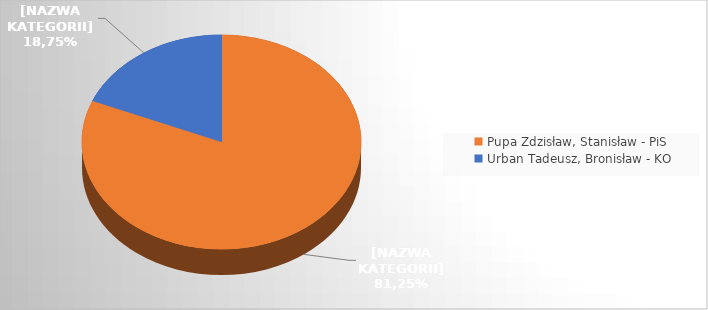
| Category | Series 0 |
|---|---|
| Pupa Zdzisław, Stanisław - PiS | 0.812 |
| Urban Tadeusz, Bronisław - KO | 0.188 |